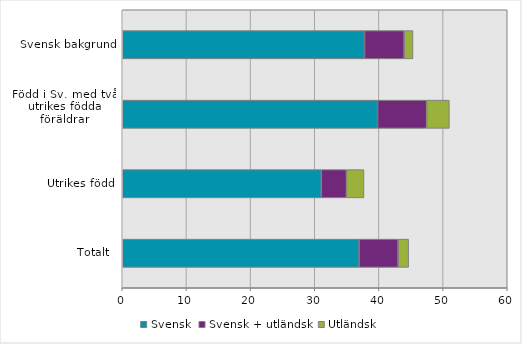
| Category | Svensk | Svensk + utländsk | Utländsk |
|---|---|---|---|
| Totalt  | 36.92 | 6.083 | 1.632 |
| Utrikes född | 31.019 | 3.925 | 2.724 |
| Född i Sv. med två 
utrikes födda föräldrar | 39.79 | 7.652 | 3.538 |
| Svensk bakgrund | 37.765 | 6.172 | 1.374 |